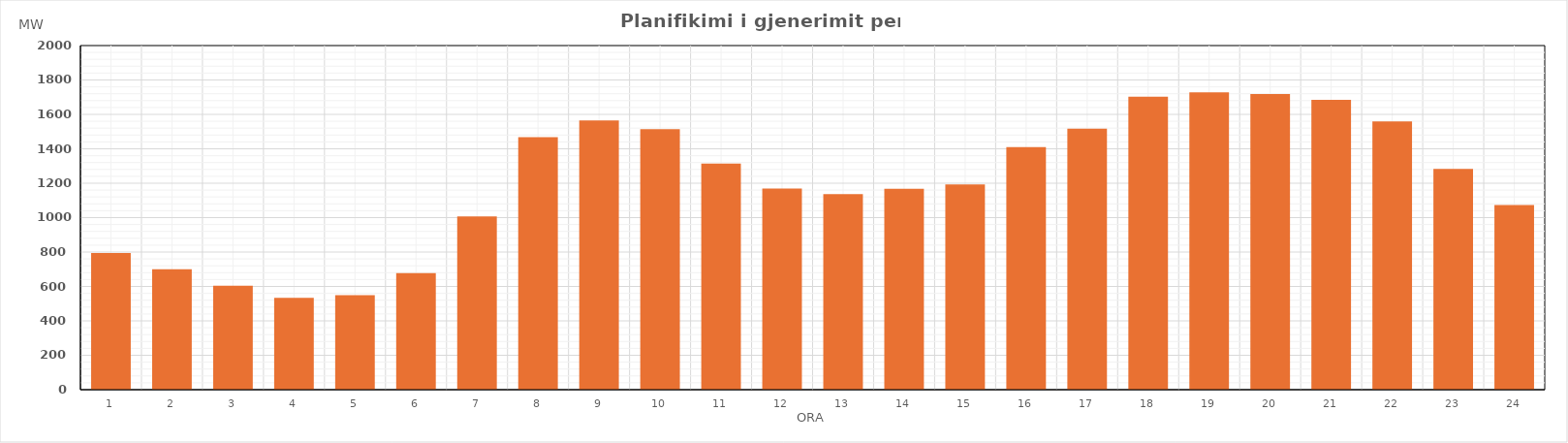
| Category | Max (MW) |
|---|---|
| 0 | 794.09 |
| 1 | 699.61 |
| 2 | 604.35 |
| 3 | 533.89 |
| 4 | 548.63 |
| 5 | 677.66 |
| 6 | 1007.55 |
| 7 | 1467.82 |
| 8 | 1564.3 |
| 9 | 1514.44 |
| 10 | 1313.47 |
| 11 | 1169.05 |
| 12 | 1137.3 |
| 13 | 1168.14 |
| 14 | 1193.49 |
| 15 | 1409.64 |
| 16 | 1516.78 |
| 17 | 1702.29 |
| 18 | 1728.84 |
| 19 | 1718.14 |
| 20 | 1684.21 |
| 21 | 1559.74 |
| 22 | 1283.18 |
| 23 | 1073.55 |